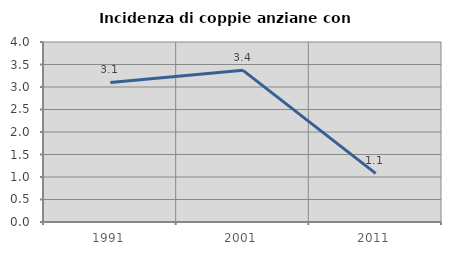
| Category | Incidenza di coppie anziane con figli |
|---|---|
| 1991.0 | 3.101 |
| 2001.0 | 3.371 |
| 2011.0 | 1.081 |